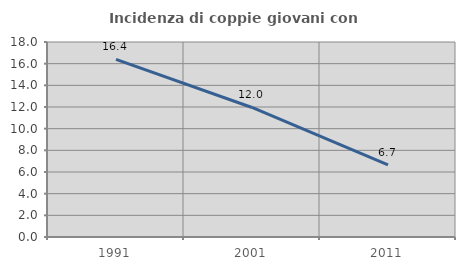
| Category | Incidenza di coppie giovani con figli |
|---|---|
| 1991.0 | 16.401 |
| 2001.0 | 11.957 |
| 2011.0 | 6.667 |